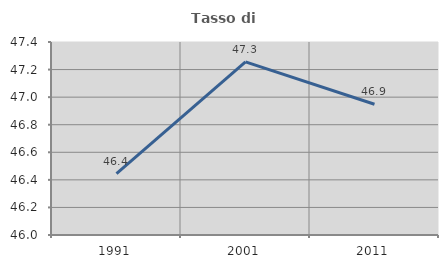
| Category | Tasso di occupazione   |
|---|---|
| 1991.0 | 46.446 |
| 2001.0 | 47.256 |
| 2011.0 | 46.948 |